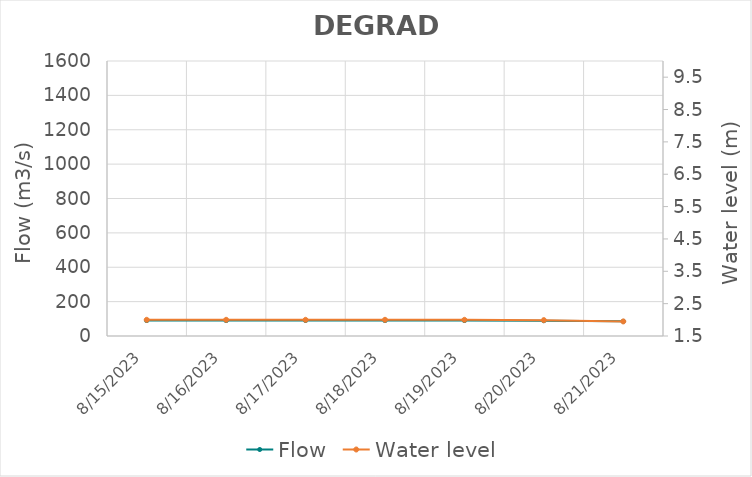
| Category | Flow |
|---|---|
| 7/20/23 | 162.38 |
| 7/19/23 | 164.13 |
| 7/18/23 | 157.5 |
| 7/17/23 | 159 |
| 7/16/23 | 153.52 |
| 7/15/23 | 150.98 |
| 7/14/23 | 158.65 |